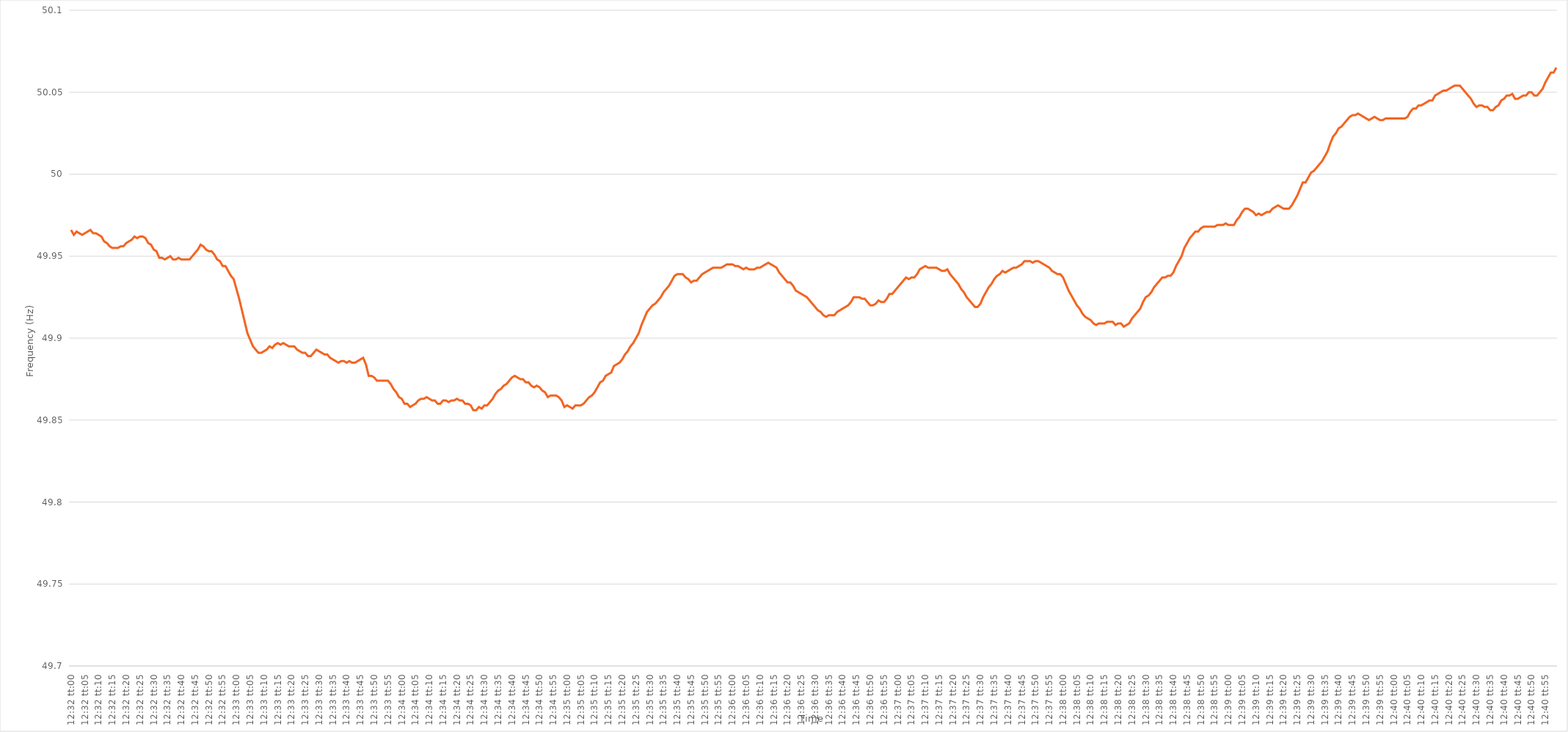
| Category | Series 0 |
|---|---|
| 0.5222222222222223 | 49.966 |
| 0.5222337962962963 | 49.963 |
| 0.5222453703703703 | 49.965 |
| 0.5222569444444444 | 49.964 |
| 0.5222685185185185 | 49.963 |
| 0.5222800925925926 | 49.964 |
| 0.5222916666666667 | 49.965 |
| 0.5223032407407407 | 49.966 |
| 0.5223148148148148 | 49.964 |
| 0.5223263888888888 | 49.964 |
| 0.522337962962963 | 49.963 |
| 0.522349537037037 | 49.962 |
| 0.5223611111111112 | 49.959 |
| 0.5223726851851852 | 49.958 |
| 0.5223842592592592 | 49.956 |
| 0.5223958333333333 | 49.955 |
| 0.5224074074074074 | 49.955 |
| 0.5224189814814815 | 49.955 |
| 0.5224305555555556 | 49.956 |
| 0.5224421296296297 | 49.956 |
| 0.5224537037037037 | 49.958 |
| 0.5224652777777777 | 49.959 |
| 0.5224768518518519 | 49.96 |
| 0.5224884259259259 | 49.962 |
| 0.5225 | 49.961 |
| 0.5225115740740741 | 49.962 |
| 0.5225231481481482 | 49.962 |
| 0.5225347222222222 | 49.961 |
| 0.5225462962962962 | 49.958 |
| 0.5225578703703704 | 49.957 |
| 0.5225694444444444 | 49.954 |
| 0.5225810185185186 | 49.953 |
| 0.5225925925925926 | 49.949 |
| 0.5226041666666666 | 49.949 |
| 0.5226157407407407 | 49.948 |
| 0.5226273148148148 | 49.949 |
| 0.5226388888888889 | 49.95 |
| 0.522650462962963 | 49.948 |
| 0.5226620370370371 | 49.948 |
| 0.5226736111111111 | 49.949 |
| 0.5226851851851851 | 49.948 |
| 0.5226967592592593 | 49.948 |
| 0.5227083333333333 | 49.948 |
| 0.5227199074074075 | 49.948 |
| 0.5227314814814815 | 49.95 |
| 0.5227430555555556 | 49.952 |
| 0.5227546296296296 | 49.954 |
| 0.5227662037037036 | 49.957 |
| 0.5227777777777778 | 49.956 |
| 0.5227893518518518 | 49.954 |
| 0.522800925925926 | 49.953 |
| 0.5228125 | 49.953 |
| 0.522824074074074 | 49.951 |
| 0.5228356481481481 | 49.948 |
| 0.5228472222222222 | 49.947 |
| 0.5228587962962963 | 49.944 |
| 0.5228703703703704 | 49.944 |
| 0.5228819444444445 | 49.941 |
| 0.5228935185185185 | 49.938 |
| 0.5229050925925925 | 49.936 |
| 0.5229166666666667 | 49.93 |
| 0.5229282407407407 | 49.924 |
| 0.5229398148148149 | 49.917 |
| 0.5229513888888889 | 49.91 |
| 0.522962962962963 | 49.903 |
| 0.522974537037037 | 49.899 |
| 0.522986111111111 | 49.895 |
| 0.5229976851851852 | 49.893 |
| 0.5230092592592592 | 49.891 |
| 0.5230208333333334 | 49.891 |
| 0.5230324074074074 | 49.892 |
| 0.5230439814814815 | 49.893 |
| 0.5230555555555555 | 49.895 |
| 0.5230671296296296 | 49.894 |
| 0.5230787037037037 | 49.896 |
| 0.5230902777777778 | 49.897 |
| 0.5231018518518519 | 49.896 |
| 0.5231134259259259 | 49.897 |
| 0.523125 | 49.896 |
| 0.5231365740740741 | 49.895 |
| 0.5231481481481481 | 49.895 |
| 0.5231597222222223 | 49.895 |
| 0.5231712962962963 | 49.893 |
| 0.5231828703703704 | 49.892 |
| 0.5231944444444444 | 49.891 |
| 0.5232060185185184 | 49.891 |
| 0.5232175925925926 | 49.889 |
| 0.5232291666666666 | 49.889 |
| 0.5232407407407408 | 49.891 |
| 0.5232523148148148 | 49.893 |
| 0.5232638888888889 | 49.892 |
| 0.5232754629629629 | 49.891 |
| 0.523287037037037 | 49.89 |
| 0.5232986111111111 | 49.89 |
| 0.5233101851851852 | 49.888 |
| 0.5233217592592593 | 49.887 |
| 0.5233333333333333 | 49.886 |
| 0.5233449074074074 | 49.885 |
| 0.5233564814814815 | 49.886 |
| 0.5233680555555555 | 49.886 |
| 0.5233796296296297 | 49.885 |
| 0.5233912037037037 | 49.886 |
| 0.5234027777777778 | 49.885 |
| 0.5234143518518518 | 49.885 |
| 0.523425925925926 | 49.886 |
| 0.5234375 | 49.887 |
| 0.523449074074074 | 49.888 |
| 0.5234606481481482 | 49.884 |
| 0.5234722222222222 | 49.877 |
| 0.5234837962962963 | 49.877 |
| 0.5234953703703703 | 49.876 |
| 0.5235069444444445 | 49.874 |
| 0.5235185185185185 | 49.874 |
| 0.5235300925925926 | 49.874 |
| 0.5235416666666667 | 49.874 |
| 0.5235532407407407 | 49.874 |
| 0.5235648148148148 | 49.872 |
| 0.5235763888888889 | 49.869 |
| 0.523587962962963 | 49.867 |
| 0.5235995370370371 | 49.864 |
| 0.5236111111111111 | 49.863 |
| 0.5236226851851852 | 49.86 |
| 0.5236342592592592 | 49.86 |
| 0.5236458333333334 | 49.858 |
| 0.5236574074074074 | 49.859 |
| 0.5236689814814816 | 49.86 |
| 0.5236805555555556 | 49.862 |
| 0.5236921296296296 | 49.863 |
| 0.5237037037037037 | 49.863 |
| 0.5237152777777777 | 49.864 |
| 0.5237268518518519 | 49.863 |
| 0.5237384259259259 | 49.862 |
| 0.52375 | 49.862 |
| 0.5237615740740741 | 49.86 |
| 0.5237731481481481 | 49.86 |
| 0.5237847222222222 | 49.862 |
| 0.5237962962962963 | 49.862 |
| 0.5238078703703704 | 49.861 |
| 0.5238194444444445 | 49.862 |
| 0.5238310185185185 | 49.862 |
| 0.5238425925925926 | 49.863 |
| 0.5238541666666666 | 49.862 |
| 0.5238657407407408 | 49.862 |
| 0.5238773148148148 | 49.86 |
| 0.523888888888889 | 49.86 |
| 0.523900462962963 | 49.859 |
| 0.523912037037037 | 49.856 |
| 0.5239236111111111 | 49.856 |
| 0.5239351851851851 | 49.858 |
| 0.5239467592592593 | 49.857 |
| 0.5239583333333333 | 49.859 |
| 0.5239699074074075 | 49.859 |
| 0.5239814814814815 | 49.861 |
| 0.5239930555555555 | 49.863 |
| 0.5240046296296296 | 49.866 |
| 0.5240162037037037 | 49.868 |
| 0.5240277777777778 | 49.869 |
| 0.5240393518518519 | 49.871 |
| 0.524050925925926 | 49.872 |
| 0.5240625 | 49.874 |
| 0.524074074074074 | 49.876 |
| 0.5240856481481482 | 49.877 |
| 0.5240972222222222 | 49.876 |
| 0.5241087962962964 | 49.875 |
| 0.5241203703703704 | 49.875 |
| 0.5241319444444444 | 49.873 |
| 0.5241435185185185 | 49.873 |
| 0.5241550925925925 | 49.871 |
| 0.5241666666666667 | 49.87 |
| 0.5241782407407407 | 49.871 |
| 0.5241898148148149 | 49.87 |
| 0.5242013888888889 | 49.868 |
| 0.5242129629629629 | 49.867 |
| 0.524224537037037 | 49.864 |
| 0.5242361111111111 | 49.865 |
| 0.5242476851851852 | 49.865 |
| 0.5242592592592593 | 49.865 |
| 0.5242708333333334 | 49.864 |
| 0.5242824074074074 | 49.862 |
| 0.5242939814814814 | 49.858 |
| 0.5243055555555556 | 49.859 |
| 0.5243171296296296 | 49.858 |
| 0.5243287037037038 | 49.857 |
| 0.5243402777777778 | 49.859 |
| 0.5243518518518518 | 49.859 |
| 0.5243634259259259 | 49.859 |
| 0.524375 | 49.86 |
| 0.5243865740740741 | 49.862 |
| 0.5243981481481481 | 49.864 |
| 0.5244097222222223 | 49.865 |
| 0.5244212962962963 | 49.867 |
| 0.5244328703703703 | 49.87 |
| 0.5244444444444444 | 49.873 |
| 0.5244560185185185 | 49.874 |
| 0.5244675925925926 | 49.877 |
| 0.5244791666666667 | 49.878 |
| 0.5244907407407408 | 49.879 |
| 0.5245023148148148 | 49.883 |
| 0.5245138888888888 | 49.884 |
| 0.524525462962963 | 49.885 |
| 0.524537037037037 | 49.887 |
| 0.5245486111111112 | 49.89 |
| 0.5245601851851852 | 49.892 |
| 0.5245717592592593 | 49.895 |
| 0.5245833333333333 | 49.897 |
| 0.5245949074074074 | 49.9 |
| 0.5246064814814815 | 49.903 |
| 0.5246180555555556 | 49.908 |
| 0.5246296296296297 | 49.912 |
| 0.5246412037037037 | 49.916 |
| 0.5246527777777777 | 49.918 |
| 0.5246643518518518 | 49.92 |
| 0.5246759259259259 | 49.921 |
| 0.5246875 | 49.923 |
| 0.5246990740740741 | 49.925 |
| 0.5247106481481482 | 49.928 |
| 0.5247222222222222 | 49.93 |
| 0.5247337962962962 | 49.932 |
| 0.5247453703703704 | 49.935 |
| 0.5247569444444444 | 49.938 |
| 0.5247685185185186 | 49.939 |
| 0.5247800925925926 | 49.939 |
| 0.5247916666666667 | 49.939 |
| 0.5248032407407407 | 49.937 |
| 0.5248148148148148 | 49.936 |
| 0.5248263888888889 | 49.934 |
| 0.524837962962963 | 49.935 |
| 0.5248495370370371 | 49.935 |
| 0.5248611111111111 | 49.937 |
| 0.5248726851851852 | 49.939 |
| 0.5248842592592592 | 49.94 |
| 0.5248958333333333 | 49.941 |
| 0.5249074074074074 | 49.942 |
| 0.5249189814814815 | 49.943 |
| 0.5249305555555556 | 49.943 |
| 0.5249421296296296 | 49.943 |
| 0.5249537037037036 | 49.943 |
| 0.5249652777777778 | 49.944 |
| 0.5249768518518518 | 49.945 |
| 0.524988425925926 | 49.945 |
| 0.525 | 49.945 |
| 0.5250115740740741 | 49.944 |
| 0.5250231481481481 | 49.944 |
| 0.5250347222222222 | 49.943 |
| 0.5250462962962963 | 49.942 |
| 0.5250578703703704 | 49.943 |
| 0.5250694444444445 | 49.942 |
| 0.5250810185185185 | 49.942 |
| 0.5250925925925926 | 49.942 |
| 0.5251041666666666 | 49.943 |
| 0.5251157407407407 | 49.943 |
| 0.5251273148148148 | 49.944 |
| 0.5251388888888889 | 49.945 |
| 0.525150462962963 | 49.946 |
| 0.525162037037037 | 49.945 |
| 0.525173611111111 | 49.944 |
| 0.5251851851851852 | 49.943 |
| 0.5251967592592592 | 49.94 |
| 0.5252083333333334 | 49.938 |
| 0.5252199074074074 | 49.936 |
| 0.5252314814814815 | 49.934 |
| 0.5252430555555555 | 49.934 |
| 0.5252546296296297 | 49.932 |
| 0.5252662037037037 | 49.929 |
| 0.5252777777777778 | 49.928 |
| 0.5252893518518519 | 49.927 |
| 0.5253009259259259 | 49.926 |
| 0.5253125 | 49.925 |
| 0.5253240740740741 | 49.923 |
| 0.5253356481481481 | 49.921 |
| 0.5253472222222222 | 49.919 |
| 0.5253587962962963 | 49.917 |
| 0.5253703703703704 | 49.916 |
| 0.5253819444444444 | 49.914 |
| 0.5253935185185185 | 49.913 |
| 0.5254050925925926 | 49.914 |
| 0.5254166666666666 | 49.914 |
| 0.5254282407407408 | 49.914 |
| 0.5254398148148148 | 49.916 |
| 0.5254513888888889 | 49.917 |
| 0.5254629629629629 | 49.918 |
| 0.5254745370370371 | 49.919 |
| 0.5254861111111111 | 49.92 |
| 0.5254976851851852 | 49.922 |
| 0.5255092592592593 | 49.925 |
| 0.5255208333333333 | 49.925 |
| 0.5255324074074074 | 49.925 |
| 0.5255439814814815 | 49.924 |
| 0.5255555555555556 | 49.924 |
| 0.5255671296296297 | 49.922 |
| 0.5255787037037037 | 49.92 |
| 0.5255902777777778 | 49.92 |
| 0.5256018518518518 | 49.921 |
| 0.5256134259259259 | 49.923 |
| 0.525625 | 49.922 |
| 0.525636574074074 | 49.922 |
| 0.5256481481481482 | 49.924 |
| 0.5256597222222222 | 49.927 |
| 0.5256712962962963 | 49.927 |
| 0.5256828703703703 | 49.929 |
| 0.5256944444444445 | 49.931 |
| 0.5257060185185185 | 49.933 |
| 0.5257175925925927 | 49.935 |
| 0.5257291666666667 | 49.937 |
| 0.5257407407407407 | 49.936 |
| 0.5257523148148148 | 49.937 |
| 0.5257638888888889 | 49.937 |
| 0.525775462962963 | 49.939 |
| 0.5257870370370371 | 49.942 |
| 0.5257986111111111 | 49.943 |
| 0.5258101851851852 | 49.944 |
| 0.5258217592592592 | 49.943 |
| 0.5258333333333333 | 49.943 |
| 0.5258449074074074 | 49.943 |
| 0.5258564814814815 | 49.943 |
| 0.5258680555555556 | 49.942 |
| 0.5258796296296296 | 49.941 |
| 0.5258912037037037 | 49.941 |
| 0.5259027777777777 | 49.942 |
| 0.5259143518518519 | 49.939 |
| 0.5259259259259259 | 49.937 |
| 0.5259375000000001 | 49.935 |
| 0.5259490740740741 | 49.933 |
| 0.5259606481481481 | 49.93 |
| 0.5259722222222222 | 49.928 |
| 0.5259837962962963 | 49.925 |
| 0.5259953703703704 | 49.923 |
| 0.5260069444444445 | 49.921 |
| 0.5260185185185186 | 49.919 |
| 0.5260300925925926 | 49.919 |
| 0.5260416666666666 | 49.921 |
| 0.5260532407407407 | 49.925 |
| 0.5260648148148148 | 49.928 |
| 0.5260763888888889 | 49.931 |
| 0.526087962962963 | 49.933 |
| 0.526099537037037 | 49.936 |
| 0.5261111111111111 | 49.938 |
| 0.5261226851851851 | 49.939 |
| 0.5261342592592593 | 49.941 |
| 0.5261458333333333 | 49.94 |
| 0.5261574074074075 | 49.941 |
| 0.5261689814814815 | 49.942 |
| 0.5261805555555555 | 49.943 |
| 0.5261921296296296 | 49.943 |
| 0.5262037037037037 | 49.944 |
| 0.5262152777777778 | 49.945 |
| 0.5262268518518519 | 49.947 |
| 0.526238425925926 | 49.947 |
| 0.52625 | 49.947 |
| 0.526261574074074 | 49.946 |
| 0.5262731481481482 | 49.947 |
| 0.5262847222222222 | 49.947 |
| 0.5262962962962963 | 49.946 |
| 0.5263078703703704 | 49.945 |
| 0.5263194444444445 | 49.944 |
| 0.5263310185185185 | 49.943 |
| 0.5263425925925925 | 49.941 |
| 0.5263541666666667 | 49.94 |
| 0.5263657407407407 | 49.939 |
| 0.5263773148148149 | 49.939 |
| 0.5263888888888889 | 49.937 |
| 0.526400462962963 | 49.933 |
| 0.526412037037037 | 49.929 |
| 0.5264236111111111 | 49.926 |
| 0.5264351851851852 | 49.923 |
| 0.5264467592592593 | 49.92 |
| 0.5264583333333334 | 49.918 |
| 0.5264699074074074 | 49.915 |
| 0.5264814814814814 | 49.913 |
| 0.5264930555555556 | 49.912 |
| 0.5265046296296296 | 49.911 |
| 0.5265162037037037 | 49.909 |
| 0.5265277777777778 | 49.908 |
| 0.5265393518518519 | 49.909 |
| 0.5265509259259259 | 49.909 |
| 0.5265624999999999 | 49.909 |
| 0.5265740740740741 | 49.91 |
| 0.5265856481481481 | 49.91 |
| 0.5265972222222223 | 49.91 |
| 0.5266087962962963 | 49.908 |
| 0.5266203703703703 | 49.909 |
| 0.5266319444444444 | 49.909 |
| 0.5266435185185185 | 49.907 |
| 0.5266550925925926 | 49.908 |
| 0.5266666666666667 | 49.909 |
| 0.5266782407407408 | 49.912 |
| 0.5266898148148148 | 49.914 |
| 0.5267013888888888 | 49.916 |
| 0.526712962962963 | 49.918 |
| 0.526724537037037 | 49.922 |
| 0.5267361111111112 | 49.925 |
| 0.5267476851851852 | 49.926 |
| 0.5267592592592593 | 49.928 |
| 0.5267708333333333 | 49.931 |
| 0.5267824074074073 | 49.933 |
| 0.5267939814814815 | 49.935 |
| 0.5268055555555555 | 49.937 |
| 0.5268171296296297 | 49.937 |
| 0.5268287037037037 | 49.938 |
| 0.5268402777777778 | 49.938 |
| 0.5268518518518518 | 49.94 |
| 0.5268634259259259 | 49.944 |
| 0.526875 | 49.947 |
| 0.5268865740740741 | 49.95 |
| 0.5268981481481482 | 49.955 |
| 0.5269097222222222 | 49.958 |
| 0.5269212962962962 | 49.961 |
| 0.5269328703703704 | 49.963 |
| 0.5269444444444444 | 49.965 |
| 0.5269560185185186 | 49.965 |
| 0.5269675925925926 | 49.967 |
| 0.5269791666666667 | 49.968 |
| 0.5269907407407407 | 49.968 |
| 0.5270023148148147 | 49.968 |
| 0.5270138888888889 | 49.968 |
| 0.5270254629629629 | 49.968 |
| 0.5270370370370371 | 49.969 |
| 0.5270486111111111 | 49.969 |
| 0.5270601851851852 | 49.969 |
| 0.5270717592592592 | 49.97 |
| 0.5270833333333333 | 49.969 |
| 0.5270949074074074 | 49.969 |
| 0.5271064814814815 | 49.969 |
| 0.5271180555555556 | 49.972 |
| 0.5271296296296296 | 49.974 |
| 0.5271412037037037 | 49.977 |
| 0.5271527777777778 | 49.979 |
| 0.5271643518518518 | 49.979 |
| 0.527175925925926 | 49.978 |
| 0.5271875 | 49.977 |
| 0.5271990740740741 | 49.975 |
| 0.5272106481481481 | 49.976 |
| 0.5272222222222223 | 49.975 |
| 0.5272337962962963 | 49.976 |
| 0.5272453703703703 | 49.977 |
| 0.5272569444444445 | 49.977 |
| 0.5272685185185185 | 49.979 |
| 0.5272800925925926 | 49.98 |
| 0.5272916666666666 | 49.981 |
| 0.5273032407407408 | 49.98 |
| 0.5273148148148148 | 49.979 |
| 0.5273263888888889 | 49.979 |
| 0.527337962962963 | 49.979 |
| 0.527349537037037 | 49.981 |
| 0.5273611111111111 | 49.984 |
| 0.5273726851851852 | 49.987 |
| 0.5273842592592592 | 49.991 |
| 0.5273958333333334 | 49.995 |
| 0.5274074074074074 | 49.995 |
| 0.5274189814814815 | 49.998 |
| 0.5274305555555555 | 50.001 |
| 0.5274421296296297 | 50.002 |
| 0.5274537037037037 | 50.004 |
| 0.5274652777777777 | 50.006 |
| 0.5274768518518519 | 50.008 |
| 0.5274884259259259 | 50.011 |
| 0.5275 | 50.014 |
| 0.527511574074074 | 50.019 |
| 0.5275231481481482 | 50.023 |
| 0.5275347222222222 | 50.025 |
| 0.5275462962962963 | 50.028 |
| 0.5275578703703704 | 50.029 |
| 0.5275694444444444 | 50.031 |
| 0.5275810185185185 | 50.033 |
| 0.5275925925925926 | 50.035 |
| 0.5276041666666667 | 50.036 |
| 0.5276157407407408 | 50.036 |
| 0.5276273148148148 | 50.037 |
| 0.5276388888888889 | 50.036 |
| 0.5276504629629629 | 50.035 |
| 0.5276620370370371 | 50.034 |
| 0.5276736111111111 | 50.033 |
| 0.5276851851851853 | 50.034 |
| 0.5276967592592593 | 50.035 |
| 0.5277083333333333 | 50.034 |
| 0.5277199074074074 | 50.033 |
| 0.5277314814814814 | 50.033 |
| 0.5277430555555556 | 50.034 |
| 0.5277546296296296 | 50.034 |
| 0.5277662037037038 | 50.034 |
| 0.5277777777777778 | 50.034 |
| 0.5277893518518518 | 50.034 |
| 0.5278009259259259 | 50.034 |
| 0.5278125 | 50.034 |
| 0.5278240740740741 | 50.034 |
| 0.5278356481481482 | 50.035 |
| 0.5278472222222222 | 50.038 |
| 0.5278587962962963 | 50.04 |
| 0.5278703703703703 | 50.04 |
| 0.5278819444444445 | 50.042 |
| 0.5278935185185185 | 50.042 |
| 0.5279050925925927 | 50.043 |
| 0.5279166666666667 | 50.044 |
| 0.5279282407407407 | 50.045 |
| 0.5279398148148148 | 50.045 |
| 0.5279513888888888 | 50.048 |
| 0.527962962962963 | 50.049 |
| 0.527974537037037 | 50.05 |
| 0.5279861111111112 | 50.051 |
| 0.5279976851851852 | 50.051 |
| 0.5280092592592592 | 50.052 |
| 0.5280208333333333 | 50.053 |
| 0.5280324074074074 | 50.054 |
| 0.5280439814814815 | 50.054 |
| 0.5280555555555556 | 50.054 |
| 0.5280671296296297 | 50.052 |
| 0.5280787037037037 | 50.05 |
| 0.5280902777777777 | 50.048 |
| 0.5281018518518519 | 50.046 |
| 0.5281134259259259 | 50.043 |
| 0.5281250000000001 | 50.041 |
| 0.5281365740740741 | 50.042 |
| 0.5281481481481481 | 50.042 |
| 0.5281597222222222 | 50.041 |
| 0.5281712962962963 | 50.041 |
| 0.5281828703703704 | 50.039 |
| 0.5281944444444444 | 50.039 |
| 0.5282060185185186 | 50.041 |
| 0.5282175925925926 | 50.042 |
| 0.5282291666666666 | 50.045 |
| 0.5282407407407407 | 50.046 |
| 0.5282523148148148 | 50.048 |
| 0.5282638888888889 | 50.048 |
| 0.528275462962963 | 50.049 |
| 0.528287037037037 | 50.046 |
| 0.5282986111111111 | 50.046 |
| 0.5283101851851851 | 50.047 |
| 0.5283217592592593 | 50.048 |
| 0.5283333333333333 | 50.048 |
| 0.5283449074074075 | 50.05 |
| 0.5283564814814815 | 50.05 |
| 0.5283680555555555 | 50.048 |
| 0.5283796296296296 | 50.048 |
| 0.5283912037037037 | 50.05 |
| 0.5284027777777778 | 50.052 |
| 0.5284143518518518 | 50.056 |
| 0.528425925925926 | 50.059 |
| 0.5284375 | 50.062 |
| 0.528449074074074 | 50.062 |
| 0.5284606481481481 | 50.065 |